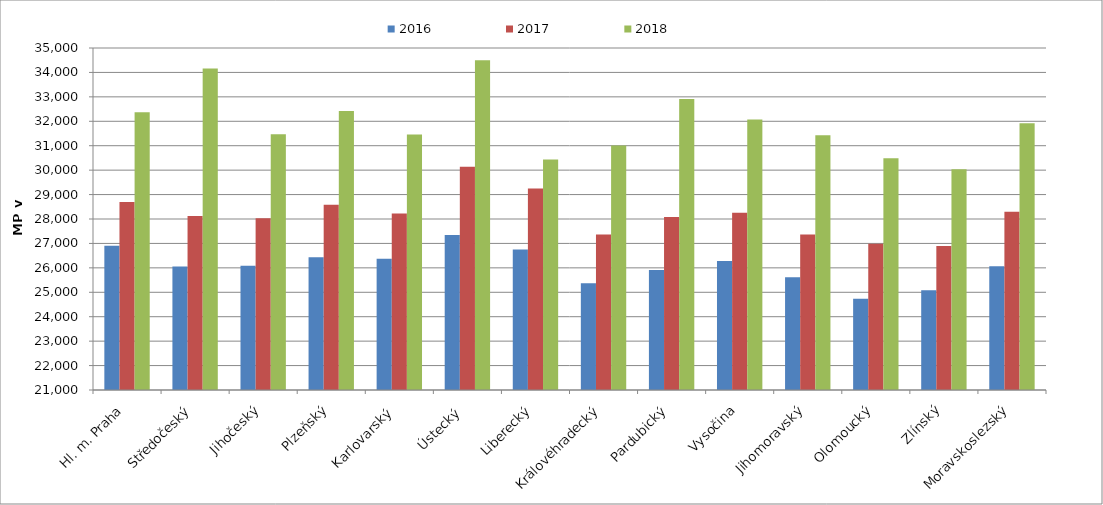
| Category | 2016 | 2017 | 2018 |
|---|---|---|---|
| Hl. m. Praha | 26909.953 | 28692.094 | 32374.63 |
| Středočeský | 26056.753 | 28127.585 | 34162.097 |
| Jihočeský | 26087.968 | 28033.978 | 31472.308 |
| Plzeňský | 26432.89 | 28585.445 | 32416.723 |
| Karlovarský  | 26374.085 | 28228.138 | 31462.829 |
| Ústecký   | 27342.48 | 30141.205 | 34497.535 |
| Liberecký | 26753.872 | 29249.434 | 30439.786 |
| Královéhradecký | 25367.188 | 27364.034 | 31007.874 |
| Pardubický | 25914.267 | 28080.963 | 32910.763 |
| Vysočina | 26276.277 | 28260.345 | 32076.923 |
| Jihomoravský | 25614.526 | 27369.828 | 31424.472 |
| Olomoucký | 24736.597 | 26982.286 | 30489.01 |
| Zlínský | 25078.544 | 26899.793 | 30041.031 |
| Moravskoslezský | 26067.553 | 28299.22 | 31923.598 |